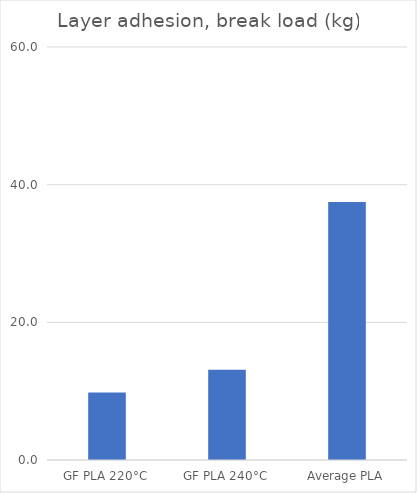
| Category | Average (kg) |
|---|---|
| GF PLA 220°C | 9.8 |
| GF PLA 240°C | 13.1 |
| Average PLA | 37.5 |